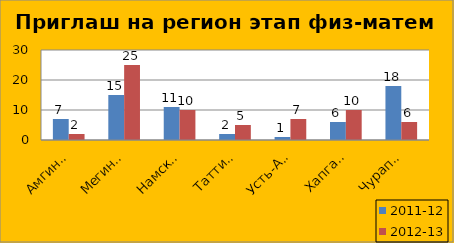
| Category | 2011-12 | 2012-13 |
|---|---|---|
| Амгинский | 7 | 2 |
| Мегино-Кангаласс | 15 | 25 |
| Намский | 11 | 10 |
| Таттинский | 2 | 5 |
| Усть-Алданский | 1 | 7 |
| Хапгаласский | 6 | 10 |
| Чурапчинский | 18 | 6 |